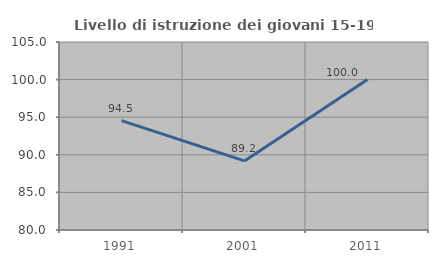
| Category | Livello di istruzione dei giovani 15-19 anni |
|---|---|
| 1991.0 | 94.545 |
| 2001.0 | 89.189 |
| 2011.0 | 100 |